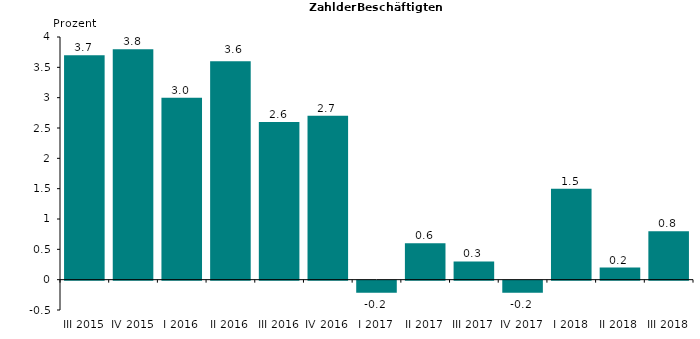
| Category | 3,7 3,8 3,0 3,6 2,6 2,7 -0,2 0,6 0,3 -0,2 1,5 0,2 0,8 |
|---|---|
| III 2015 | 3.7 |
| IV 2015 | 3.8 |
| I 2016 | 3 |
| II 2016 | 3.6 |
| III 2016 | 2.6 |
| IV 2016 | 2.7 |
| I 2017 | -0.2 |
| II 2017 | 0.6 |
| III 2017 | 0.3 |
| IV 2017 | -0.2 |
| I 2018 | 1.5 |
| II 2018 | 0.2 |
| III 2018 | 0.8 |